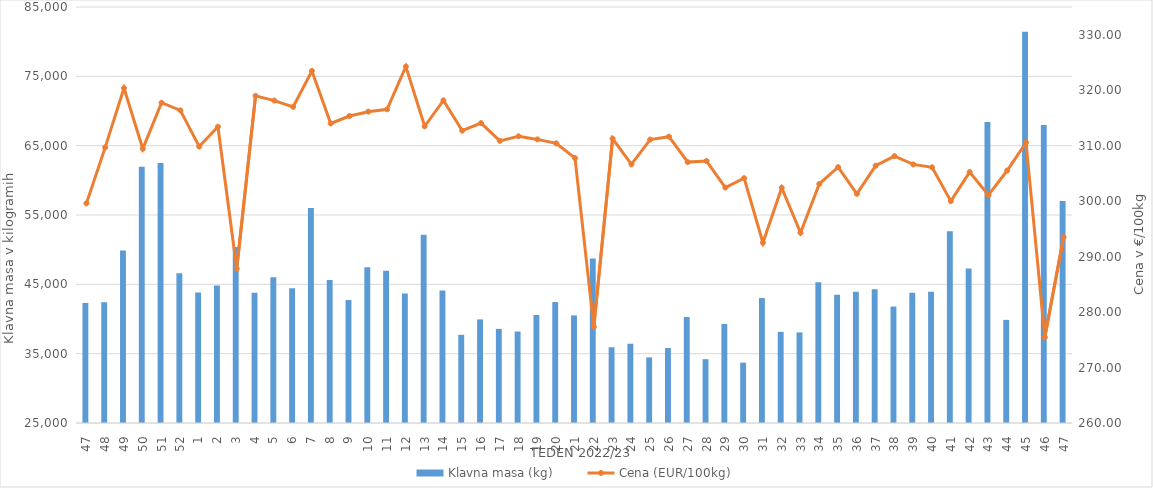
| Category | Klavna masa (kg) |
|---|---|
| 47.0 | 42319 |
| 48.0 | 42416 |
| 49.0 | 49873 |
| 50.0 | 61942 |
| 51.0 | 62514 |
| 52.0 | 46589 |
| 1.0 | 43807 |
| 2.0 | 44834 |
| 3.0 | 50386 |
| 4.0 | 43773 |
| 5.0 | 46011 |
| 6.0 | 44439 |
| 7.0 | 56001 |
| 8.0 | 45613 |
| 9.0 | 42730 |
| 10.0 | 47471 |
| 11.0 | 46952 |
| 12.0 | 43683 |
| 13.0 | 52135 |
| 14.0 | 44103 |
| 15.0 | 37719 |
| 16.0 | 39943 |
| 17.0 | 38574 |
| 18.0 | 38200 |
| 19.0 | 40581 |
| 20.0 | 42443 |
| 21.0 | 40517 |
| 22.0 | 48742 |
| 23.0 | 35927 |
| 24.0 | 36436 |
| 25.0 | 34463 |
| 26.0 | 35812 |
| 27.0 | 40280 |
| 28.0 | 34201 |
| 29.0 | 39279 |
| 30.0 | 33702 |
| 31.0 | 43020 |
| 32.0 | 38146 |
| 33.0 | 38070 |
| 34.0 | 45290 |
| 35.0 | 43513 |
| 36.0 | 43945 |
| 37.0 | 44302 |
| 38.0 | 41798 |
| 39.0 | 43790 |
| 40.0 | 43913 |
| 41.0 | 52663 |
| 42.0 | 47275 |
| 43.0 | 68419 |
| 44.0 | 39872 |
| 45.0 | 81439 |
| 46.0 | 67983 |
| 47.0 | 57006 |